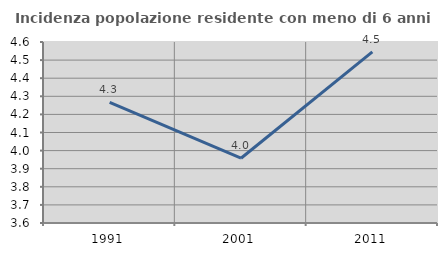
| Category | Incidenza popolazione residente con meno di 6 anni |
|---|---|
| 1991.0 | 4.267 |
| 2001.0 | 3.958 |
| 2011.0 | 4.545 |